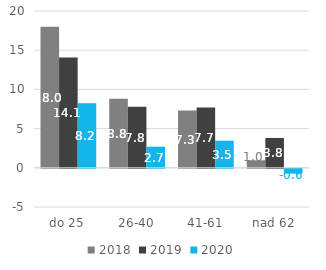
| Category | 2018 | 2019 | 2020 |
|---|---|---|---|
| 0 | 17.988 | 14.069 | 8.235 |
| 1 | 8.821 | 7.803 | 2.689 |
| 2 | 7.314 | 7.697 | 3.456 |
| 3 | 0.96 | 3.805 | -0.618 |